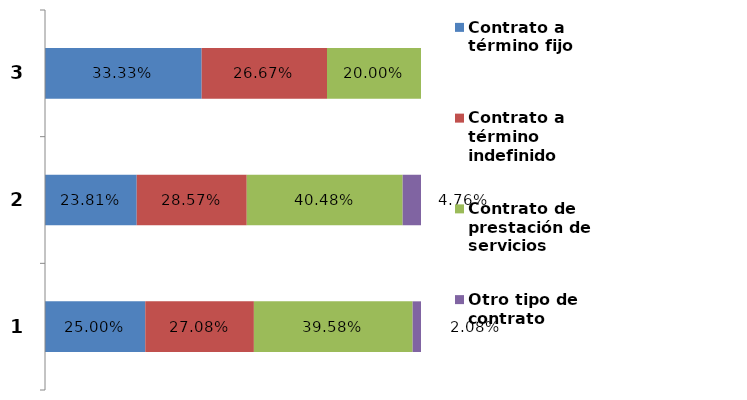
| Category | Contrato a término fijo | Contrato a término indefinido | Contrato de prestación de servicios | Otro tipo de contrato |
|---|---|---|---|---|
| 0 | 0.25 | 0.271 | 0.396 | 0.021 |
| 1 | 0.238 | 0.286 | 0.405 | 0.048 |
| 2 | 0.333 | 0.267 | 0.2 | 0 |